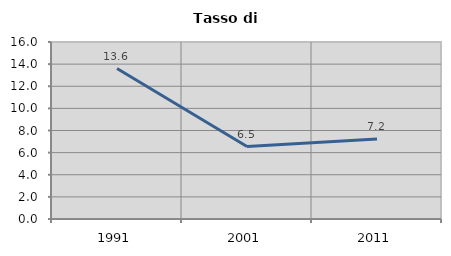
| Category | Tasso di disoccupazione   |
|---|---|
| 1991.0 | 13.604 |
| 2001.0 | 6.547 |
| 2011.0 | 7.223 |